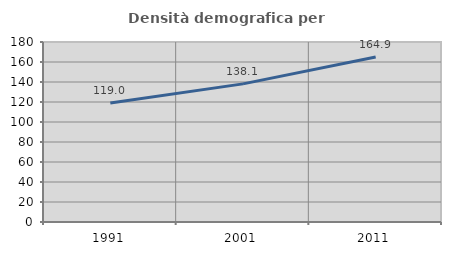
| Category | Densità demografica |
|---|---|
| 1991.0 | 119.045 |
| 2001.0 | 138.112 |
| 2011.0 | 164.91 |